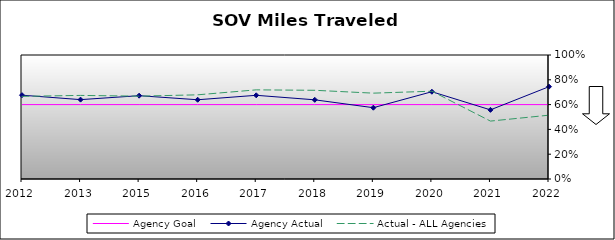
| Category | Agency Goal | Agency Actual | Actual - ALL Agencies |
|---|---|---|---|
| 2012.0 | 0.6 | 0.676 | 0.666 |
| 2013.0 | 0.6 | 0.64 | 0.674 |
| 2015.0 | 0.6 | 0.672 | 0.668 |
| 2016.0 | 0.6 | 0.639 | 0.679 |
| 2017.0 | 0.6 | 0.675 | 0.719 |
| 2018.0 | 0.6 | 0.638 | 0.715 |
| 2019.0 | 0.6 | 0.575 | 0.692 |
| 2020.0 | 0.6 | 0.704 | 0.708 |
| 2021.0 | 0.6 | 0.558 | 0.467 |
| 2022.0 | 0.6 | 0.744 | 0.515 |